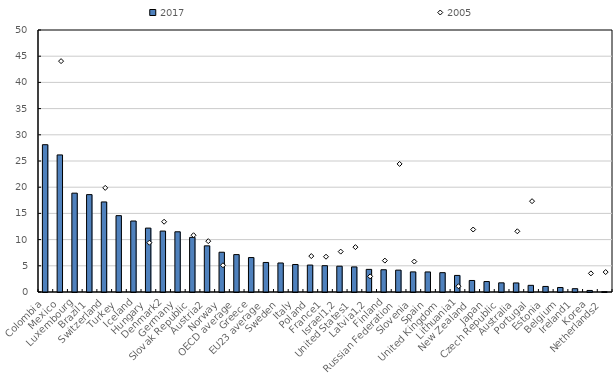
| Category | 2017 |
|---|---|
| Colombia | 28.111 |
| Mexico | 26.161 |
| Luxembourg | 18.866 |
| Brazil1 | 18.586 |
| Switzerland | 17.186 |
| Turkey | 14.569 |
| Iceland | 13.549 |
| Hungary | 12.196 |
| Denmark2 | 11.629 |
| Germany | 11.491 |
| Slovak Republic | 10.422 |
| Austria2 | 8.811 |
| Norway | 7.59 |
| OECD average | 7.137 |
| Greece | 6.574 |
| EU23 average | 5.637 |
| Sweden | 5.539 |
| Italy | 5.251 |
| Poland | 5.142 |
| France1 | 5.023 |
| Israel1,2 | 4.924 |
| United States1 | 4.788 |
| Latvia1,2 | 4.316 |
| Finland | 4.248 |
| Russian Federation | 4.174 |
| Slovenia | 3.837 |
| Spain | 3.826 |
| United Kingdom | 3.69 |
| Lithuania1 | 3.163 |
| New Zealand | 2.2 |
| Japan | 1.997 |
| Czech Republic | 1.748 |
| Australia | 1.728 |
| Portugal | 1.273 |
| Estonia | 1.059 |
| Belgium | 0.86 |
| Ireland1 | 0.633 |
| Korea | 0.293 |
| Netherlands2 | 0.064 |